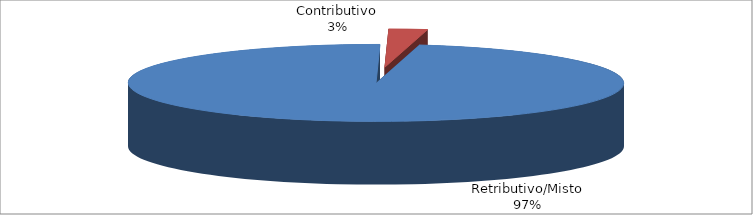
| Category | Decorrenti gennaio - marzo 2020 |
|---|---|
| Retributivo/Misto | 21446 |
| Contributivo | 555 |